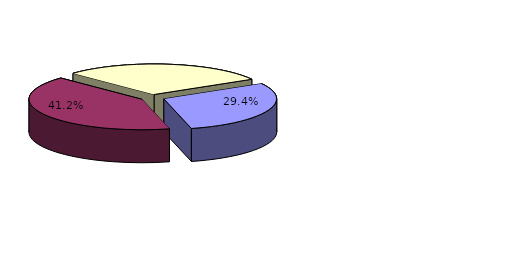
| Category | Series 0 |
|---|---|
| Philormonies | 5 |
| Concert halls  | 7 |
| Independent collectives | 5 |